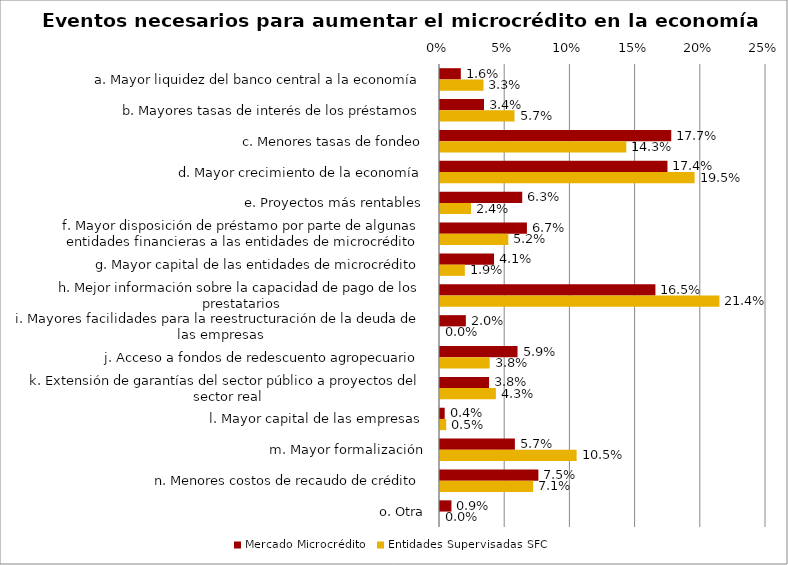
| Category | Mercado Microcrédito | Entidades Supervisadas SFC |
|---|---|---|
| a. Mayor liquidez del banco central a la economía | 0.016 | 0.033 |
| b. Mayores tasas de interés de los préstamos | 0.034 | 0.057 |
| c. Menores tasas de fondeo | 0.177 | 0.143 |
| d. Mayor crecimiento de la economía | 0.174 | 0.195 |
| e. Proyectos más rentables | 0.063 | 0.024 |
| f. Mayor disposición de préstamo por parte de algunas entidades financieras a las entidades de microcrédito | 0.067 | 0.052 |
| g. Mayor capital de las entidades de microcrédito | 0.041 | 0.019 |
| h. Mejor información sobre la capacidad de pago de los prestatarios | 0.165 | 0.214 |
| i. Mayores facilidades para la reestructuración de la deuda de las empresas | 0.02 | 0 |
| j. Acceso a fondos de redescuento agropecuario | 0.059 | 0.038 |
| k. Extensión de garantías del sector público a proyectos del sector real | 0.038 | 0.043 |
| l. Mayor capital de las empresas | 0.004 | 0.005 |
| m. Mayor formalización | 0.057 | 0.105 |
| n. Menores costos de recaudo de crédito | 0.075 | 0.071 |
| o. Otra | 0.009 | 0 |